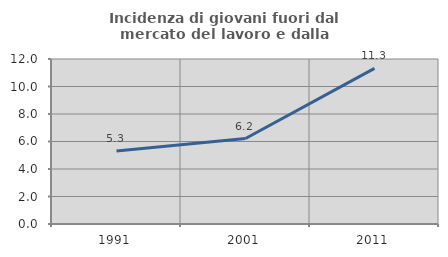
| Category | Incidenza di giovani fuori dal mercato del lavoro e dalla formazione  |
|---|---|
| 1991.0 | 5.311 |
| 2001.0 | 6.218 |
| 2011.0 | 11.321 |